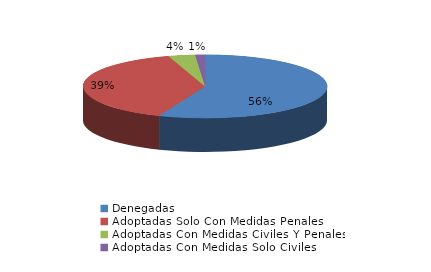
| Category | Series 0 |
|---|---|
| Denegadas | 175 |
| Adoptadas Solo Con Medidas Penales | 122 |
| Adoptadas Con Medidas Civiles Y Penales | 11 |
| Adoptadas Con Medidas Solo Civiles | 4 |